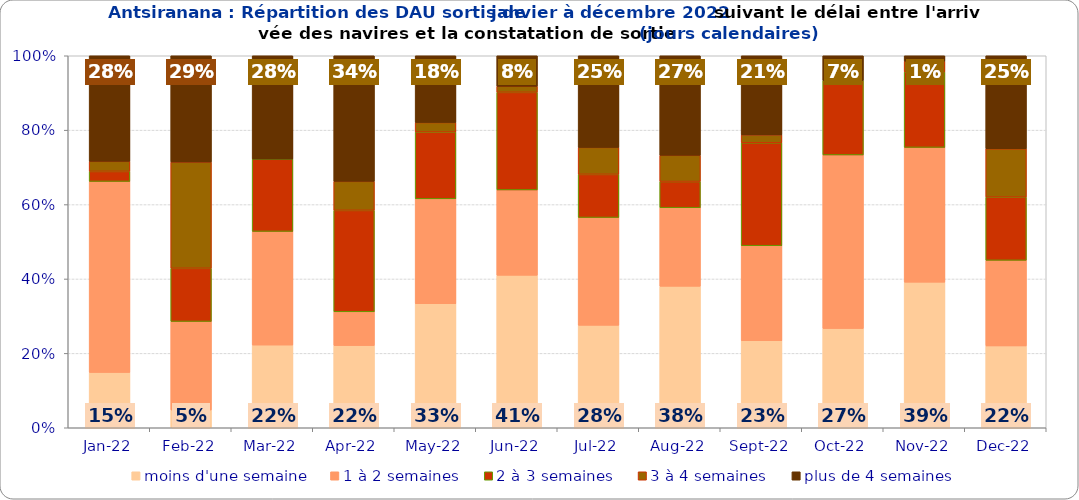
| Category | moins d'une semaine | 1 à 2 semaines | 2 à 3 semaines | 3 à 4 semaines | plus de 4 semaines |
|---|---|---|---|---|---|
| 2022-01-01 | 0.149 | 0.514 | 0.027 | 0.027 | 0.284 |
| 2022-02-01 | 0.048 | 0.238 | 0.143 | 0.286 | 0.286 |
| 2022-03-01 | 0.222 | 0.306 | 0.194 | 0 | 0.278 |
| 2022-04-01 | 0.221 | 0.091 | 0.273 | 0.078 | 0.338 |
| 2022-05-01 | 0.333 | 0.282 | 0.179 | 0.026 | 0.179 |
| 2022-06-01 | 0.41 | 0.23 | 0.262 | 0.016 | 0.082 |
| 2022-07-01 | 0.275 | 0.29 | 0.116 | 0.072 | 0.246 |
| 2022-08-01 | 0.38 | 0.211 | 0.07 | 0.07 | 0.268 |
| 2022-09-01 | 0.234 | 0.255 | 0.277 | 0.021 | 0.213 |
| 2022-10-01 | 0.267 | 0.467 | 0.2 | 0 | 0.067 |
| 2022-11-01 | 0.391 | 0.362 | 0.203 | 0.029 | 0.014 |
| 2022-12-01 | 0.22 | 0.23 | 0.17 | 0.13 | 0.25 |